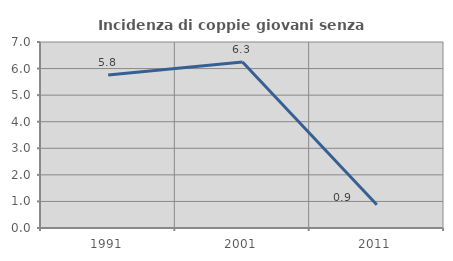
| Category | Incidenza di coppie giovani senza figli |
|---|---|
| 1991.0 | 5.755 |
| 2001.0 | 6.25 |
| 2011.0 | 0.877 |